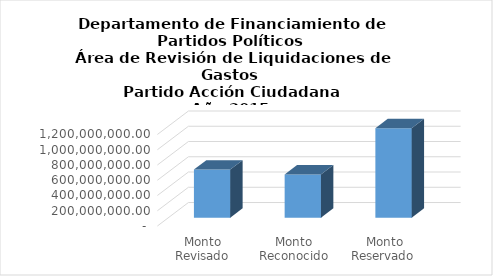
| Category | Series 0 |
|---|---|
| Monto Revisado (DFPP) | 630601662.47 |
| Monto Reconocido (TSE) | 566524354.49 |
| Monto Reservado  | 1173219361.55 |